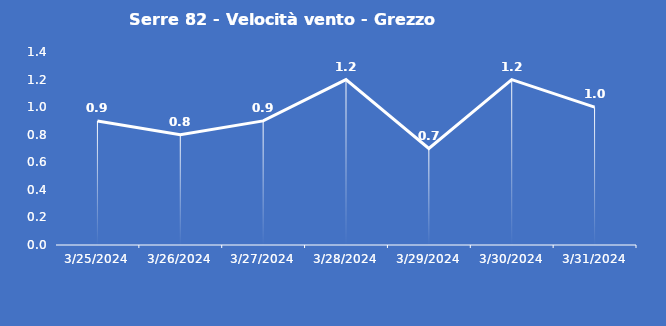
| Category | Serre 82 - Velocità vento - Grezzo (m/s) |
|---|---|
| 3/25/24 | 0.9 |
| 3/26/24 | 0.8 |
| 3/27/24 | 0.9 |
| 3/28/24 | 1.2 |
| 3/29/24 | 0.7 |
| 3/30/24 | 1.2 |
| 3/31/24 | 1 |